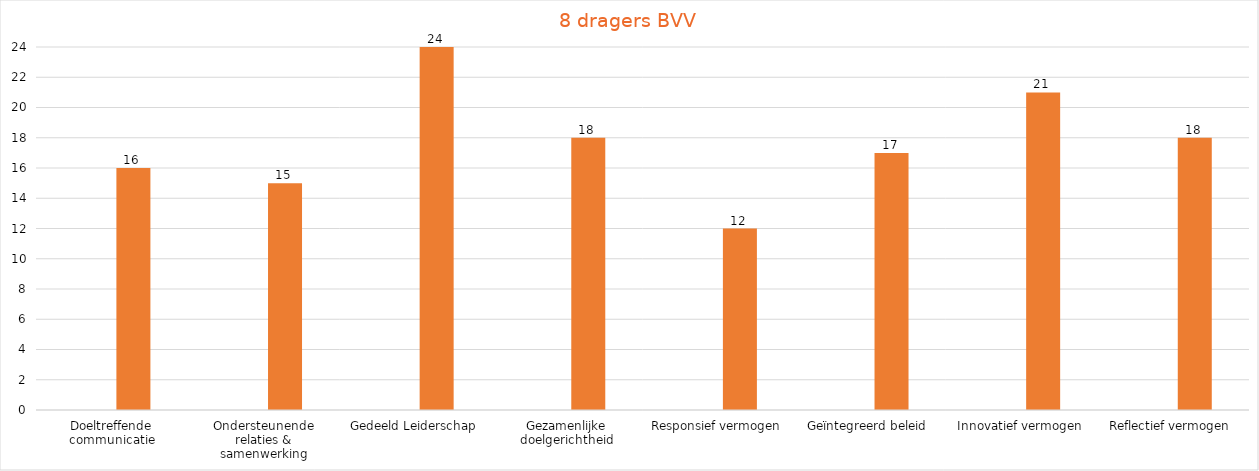
| Category | Series 0 | Series 1 |
|---|---|---|
| Doeltreffende communicatie |  | 16 |
| Ondersteunende relaties & samenwerking |  | 15 |
| Gedeeld Leiderschap |  | 24 |
| Gezamenlijke doelgerichtheid |  | 18 |
| Responsief vermogen |  | 12 |
| Geïntegreerd beleid |  | 17 |
| Innovatief vermogen |  | 21 |
| Reflectief vermogen  |  | 18 |